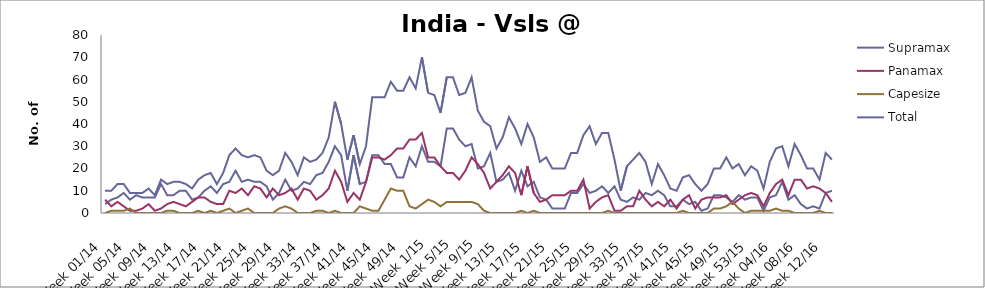
| Category | Supramax | Panamax | Capesize | Total |
|---|---|---|---|---|
| Week 01/14 | 4 | 6 | 0 | 10 |
| Week 02/14 | 6 | 3 | 1 | 10 |
| Week 03/14 | 7 | 5 | 1 | 13 |
| Week 04/14 | 9 | 3 | 1 | 13 |
| Week 05/14 | 6 | 1 | 2 | 9 |
| Week 06/14 | 8 | 1 | 0 | 9 |
| Week 07/14 | 7 | 2 | 0 | 9 |
| Week 08/14 | 7 | 4 | 0 | 11 |
| Week 09/14 | 7 | 1 | 0 | 8 |
| Week 10/14 | 13 | 2 | 0 | 15 |
| Week 11/14 | 8 | 4 | 1 | 13 |
| Week 12/14 | 8 | 5 | 1 | 14 |
| Week 13/14 | 10 | 4 | 0 | 14 |
| Week 14/14 | 10 | 3 | 0 | 13 |
| Week 15/14 | 6 | 5 | 0 | 11 |
| Week 16/14 | 7 | 7 | 1 | 15 |
| Week 17/14 | 10 | 7 | 0 | 17 |
| Week 18/14 | 12 | 5 | 1 | 18 |
| Week 19/14 | 9 | 4 | 0 | 13 |
| Week 20/14 | 13 | 4 | 1 | 18 |
| Week 21/14 | 14 | 10 | 2 | 26 |
| Week 22/14 | 19 | 9 | 0 | 29 |
| Week 23/14 | 14 | 11 | 1 | 26 |
| Week 24/14 | 15 | 8 | 2 | 25 |
| Week 25/14 | 14 | 12 | 0 | 26 |
| Week 26/14 | 14 | 11 | 0 | 25 |
| Week 27/14 | 12 | 7 | 0 | 19 |
| Week 28/14 | 6 | 11 | 0 | 17 |
| Week 29/14 | 9 | 8 | 2 | 19 |
| Week 30/14 | 15 | 9 | 3 | 27 |
| Week 31/14 | 10 | 11 | 2 | 23 |
| Week 32/14 | 11 | 6 | 0 | 17 |
| Week 33/14 | 14 | 11 | 0 | 25 |
| Week 34/14 | 13 | 10 | 0 | 23 |
| Week 35/14 | 17 | 6 | 1 | 24 |
| Week 36/14 | 18 | 8 | 1 | 27 |
| Week 37/14 | 23 | 11 | 0 | 34 |
| Week 38/14 | 30 | 19 | 1 | 50 |
| Week 39/14 | 26 | 14 | 0 | 40 |
| Week 40/14 | 10 | 5 | 0 | 24 |
| Week 41/14 | 26 | 9 | 0 | 35 |
| Week 42/14 | 13 | 6 | 3 | 22 |
| Week 43/14 | 14 | 14 | 2 | 30 |
| Week 44/14 | 26 | 25 | 1 | 52 |
| Week 45/14 | 26 | 25 | 1 | 52 |
| Week 46/14 | 22 | 24 | 6 | 52 |
| Week 47/14 | 22 | 26 | 11 | 59 |
| Week 48/14 | 16 | 29 | 10 | 55 |
| Week 49/14 | 16 | 29 | 10 | 55 |
| Week 50/14 | 25 | 33 | 3 | 61 |
| Week 51/14 | 21 | 33 | 2 | 56 |
| Week 52/14 | 30 | 36 | 4 | 70 |
| Week 1/15 | 23 | 25 | 6 | 54 |
| Week 2/15 | 23 | 25 | 5 | 53 |
| Week 3/15 | 21 | 21 | 3 | 45 |
| Week 4/15 | 38 | 18 | 5 | 61 |
| Week 5/15 | 38 | 18 | 5 | 61 |
| Week 6/15 | 33 | 15 | 5 | 53 |
| Week 7/15 | 30 | 19 | 5 | 54 |
| Week 8/15 | 31 | 25 | 5 | 61 |
| Week 9/15 | 20 | 22 | 4 | 46 |
| Week 10/15 | 21 | 18 | 1 | 41 |
| Week 11/15 | 27 | 11 | 0 | 39 |
| Week 12/15 | 14 | 14 | 0 | 29 |
| Week 13/15 | 15 | 17 | 0 | 34 |
| Week 14/15 | 18 | 21 | 0 | 43 |
| Week 15/15 | 10 | 18 | 0 | 38 |
| Week 16/15 | 19 | 8 | 1 | 31 |
| Week 17/15 | 12 | 21 | 0 | 40 |
| Week 18/15 | 14 | 9 | 1 | 34 |
| Week 19/15 | 7 | 5 | 0 | 23 |
| Week 20/15 | 6 | 6 | 0 | 25 |
| Week 21/15 | 2 | 8 | 0 | 20 |
| Week 22/15 | 2 | 8 | 0 | 20 |
| Week 23/15 | 2 | 8 | 0 | 20 |
| Week 24/15 | 9 | 10 | 0 | 27 |
| Week 25/15 | 9 | 10 | 0 | 27 |
| Week 26/15 | 13 | 15 | 0 | 35 |
| Week 27/15 | 9 | 2 | 0 | 39 |
| Week 28/15 | 10 | 5 | 0 | 31 |
| Week 29/15 | 12 | 7 | 0 | 36 |
| Week 30/15 | 9 | 8 | 1 | 36 |
| Week 31/15 | 12 | 1 | 0 | 24 |
| Week 32/15 | 6 | 1 | 0 | 10 |
| Week 33/15 | 5 | 3 | 0 | 21 |
| Week 34/15 | 7 | 3 | 0 | 24 |
| Week 35/15 | 6 | 10 | 0 | 27 |
| Week 36/15 | 9 | 6 | 0 | 23 |
| Week 37/15 | 8 | 3 | 0 | 13 |
| Week 38/15 | 10 | 5 | 0 | 22 |
| Week 39/15 | 8 | 3 | 0 | 17 |
| Week 40/15 | 3 | 6 | 0 | 11 |
| Week 41/15 | 3 | 2 | 0 | 10 |
| Week 42/15 | 6 | 6 | 1 | 16 |
| Week 43/15 | 4 | 8 | 0 | 17 |
| Week 44/15 | 5 | 2 | 0 | 13 |
| Week 45/15 | 1 | 6 | 0 | 10 |
| Week 46/15 | 2 | 7 | 0 | 13 |
| Week 47/15 | 8 | 7 | 2 | 20 |
| Week 48/15 | 8 | 7 | 2 | 20 |
| Week 49/15 | 7 | 8 | 3 | 25 |
| Week 50/15 | 5 | 4 | 5 | 20 |
| Week 51/15 | 8 | 6 | 2 | 22 |
| Week 52/15 | 6 | 8 | 0 | 17 |
| Week 53/15 | 7 | 9 | 1 | 21 |
| Week 01/16 | 7 | 8 | 1 | 19 |
| Week 02/16 | 1 | 3 | 1 | 11 |
| Week 03/16 | 7 | 9 | 1 | 23 |
| Week 04/16 | 8 | 13 | 2 | 29 |
| Week 05/16 | 14 | 15 | 1 | 30 |
| Week 06/16 | 6 | 8 | 1 | 21 |
| Week 07/16 | 8 | 15 | 0 | 31 |
| Week 08/16 | 4 | 15 | 0 | 26 |
| Week 09/16 | 2 | 11 | 0 | 20 |
| Week 10/16 | 3 | 12 | 0 | 20 |
| Week 11/16 | 2 | 11 | 1 | 15 |
| Week 12/16 | 9 | 9 | 0 | 27 |
| Week 13/16 | 10 | 5 | 0 | 24 |